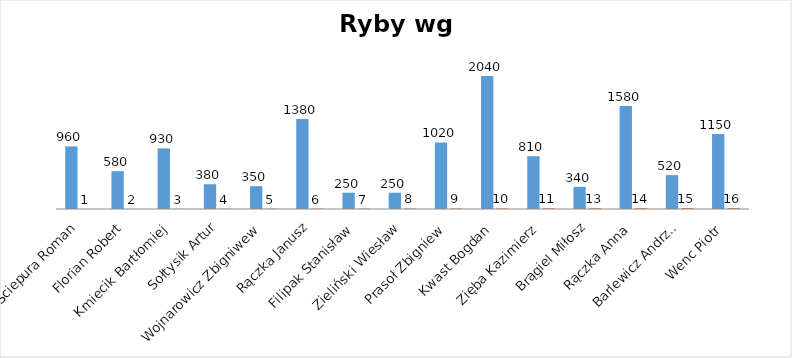
| Category | Series 0 | Series 1 |
|---|---|---|
| Ściepura Roman | 960 | 1 |
| Florian Robert | 580 | 2 |
| Kmiecik Bartłomiej | 930 | 3 |
| Sołtysik Artur | 380 | 4 |
| Wojnarowicz Zbigniwew | 350 | 5 |
| Rączka Janusz | 1380 | 6 |
| Filipak Stanisław | 250 | 7 |
| Zieliński Wiesław | 250 | 8 |
| Prasoł Zbigniew | 1020 | 9 |
| Kwast Bogdan | 2040 | 10 |
| Zięba Kazimierz | 810 | 11 |
| Brągiel Miłosz | 340 | 13 |
| Rączka Anna | 1580 | 14 |
| Barlewicz Andrzej | 520 | 15 |
| Wenc Piotr | 1150 | 16 |